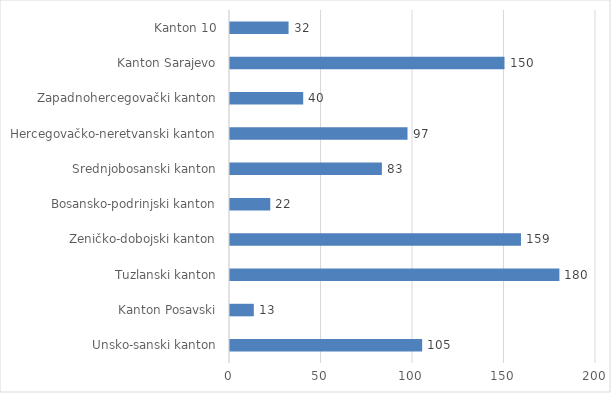
| Category | Series 0 |
|---|---|
| Unsko-sanski kanton | 105 |
| Kanton Posavski | 13 |
| Tuzlanski kanton | 180 |
| Zeničko-dobojski kanton | 159 |
| Bosansko-podrinjski kanton | 22 |
| Srednjobosanski kanton | 83 |
| Hercegovačko-neretvanski kanton | 97 |
| Zapadnohercegovački kanton | 40 |
| Kanton Sarajevo | 150 |
| Kanton 10 | 32 |